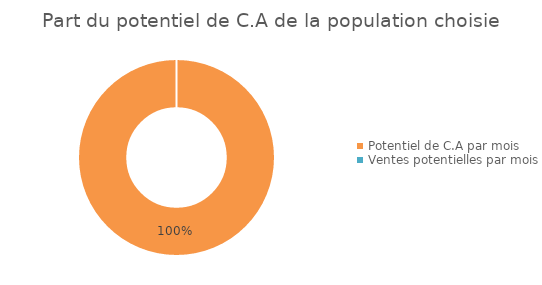
| Category | Series 0 |
|---|---|
| Potentiel de C.A par mois | 53100 |
| Ventes potentielles par mois | 0 |